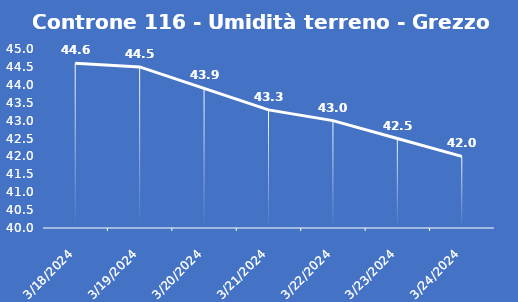
| Category | Controne 116 - Umidità terreno - Grezzo (%VWC) |
|---|---|
| 3/18/24 | 44.6 |
| 3/19/24 | 44.5 |
| 3/20/24 | 43.9 |
| 3/21/24 | 43.3 |
| 3/22/24 | 43 |
| 3/23/24 | 42.5 |
| 3/24/24 | 42 |